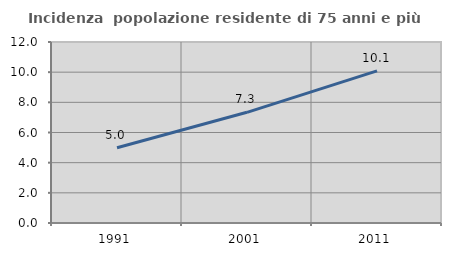
| Category | Incidenza  popolazione residente di 75 anni e più |
|---|---|
| 1991.0 | 4.99 |
| 2001.0 | 7.339 |
| 2011.0 | 10.089 |